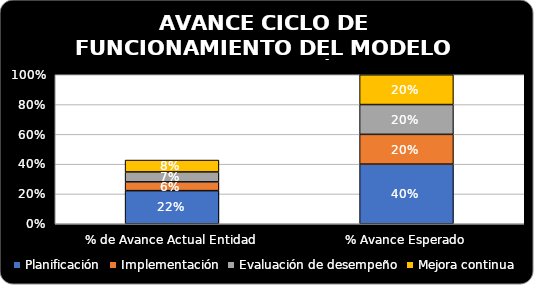
| Category | Planificación | Implementación | Evaluación de desempeño | Mejora continua |
|---|---|---|---|---|
| % de Avance Actual Entidad | 0.222 | 0.059 | 0.067 | 0.08 |
| % Avance Esperado | 0.4 | 0.2 | 0.2 | 0.2 |